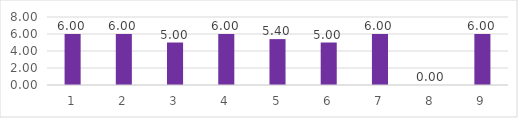
| Category | Series 0 |
|---|---|
| 0 | 6 |
| 1 | 6 |
| 2 | 5 |
| 3 | 6 |
| 4 | 5.4 |
| 5 | 5 |
| 6 | 6 |
| 7 | 0 |
| 8 | 6 |